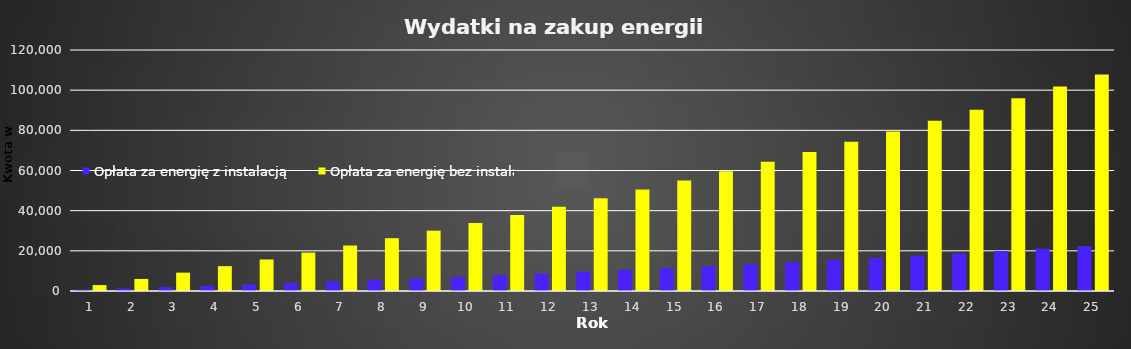
| Category | Opłata za energię z instalacją | Opłata za energię bez instalacji |
|---|---|---|
| 0 | 613.835 | 2957.27 |
| 1 | 1246.085 | 6003.258 |
| 2 | 1897.303 | 9140.626 |
| 3 | 2568.057 | 12372.115 |
| 4 | 3258.933 | 15700.548 |
| 5 | 3970.536 | 19128.834 |
| 6 | 4703.487 | 22659.97 |
| 7 | 5458.427 | 26297.039 |
| 8 | 6236.015 | 30043.22 |
| 9 | 7036.93 | 33901.786 |
| 10 | 7861.873 | 37876.11 |
| 11 | 8711.564 | 41969.663 |
| 12 | 9586.746 | 46186.023 |
| 13 | 10488.184 | 50528.874 |
| 14 | 11416.664 | 55002.01 |
| 15 | 12372.999 | 59609.34 |
| 16 | 13358.024 | 64354.891 |
| 17 | 14372.6 | 69242.807 |
| 18 | 15417.613 | 74277.362 |
| 19 | 16493.976 | 79462.952 |
| 20 | 17602.631 | 84804.111 |
| 21 | 18744.545 | 90305.504 |
| 22 | 19920.716 | 95971.939 |
| 23 | 21132.172 | 101808.368 |
| 24 | 22379.973 | 107819.889 |